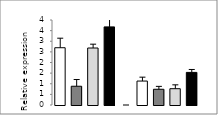
| Category | Series 0 |
|---|---|
|  - | 2.695 |
| HC | 0.882 |